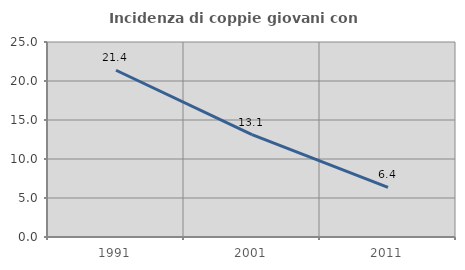
| Category | Incidenza di coppie giovani con figli |
|---|---|
| 1991.0 | 21.377 |
| 2001.0 | 13.115 |
| 2011.0 | 6.364 |